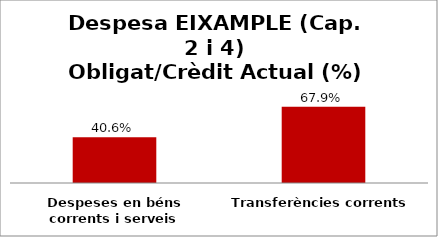
| Category | Series 0 |
|---|---|
| Despeses en béns corrents i serveis | 0.406 |
| Transferències corrents | 0.679 |